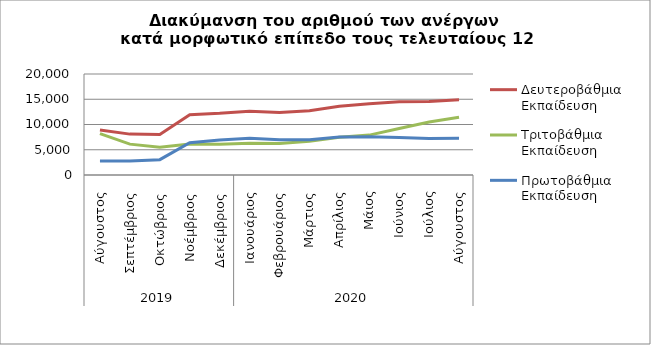
| Category | Δευτεροβάθμια Εκπαίδευση | Τριτοβάθμια Εκπαίδευση | Πρωτοβάθμια Εκπαίδευση |
|---|---|---|---|
| 0 | 8918 | 8210 | 2755 |
| 1 | 8096 | 6115 | 2757 |
| 2 | 7999 | 5505 | 3040 |
| 3 | 11945 | 6155 | 6395 |
| 4 | 12223 | 6111 | 6951 |
| 5 | 12645 | 6303 | 7266 |
| 6 | 12391 | 6258 | 6971 |
| 7 | 12702 | 6691 | 6960 |
| 8 | 13630 | 7456 | 7505 |
| 9 | 14114 | 7899 | 7591 |
| 10 | 14517 | 9211 | 7430 |
| 11 | 14575 | 10490 | 7248 |
| 12 | 14921 | 11427 | 7301 |